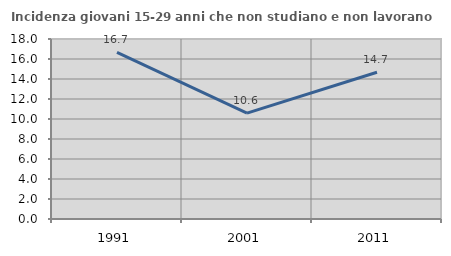
| Category | Incidenza giovani 15-29 anni che non studiano e non lavorano  |
|---|---|
| 1991.0 | 16.667 |
| 2001.0 | 10.588 |
| 2011.0 | 14.679 |